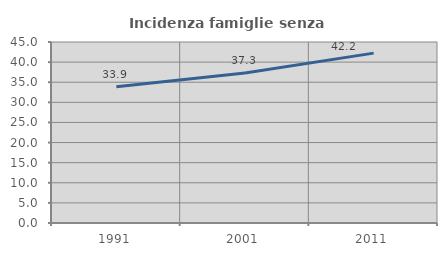
| Category | Incidenza famiglie senza nuclei |
|---|---|
| 1991.0 | 33.881 |
| 2001.0 | 37.308 |
| 2011.0 | 42.238 |